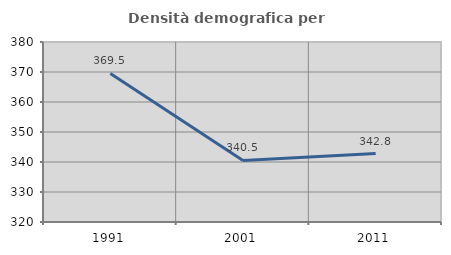
| Category | Densità demografica |
|---|---|
| 1991.0 | 369.53 |
| 2001.0 | 340.515 |
| 2011.0 | 342.822 |